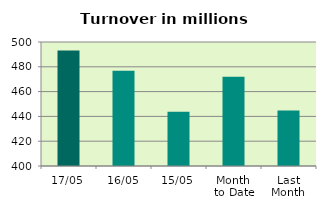
| Category | Series 0 |
|---|---|
| 17/05 | 493.06 |
| 16/05 | 476.755 |
| 15/05 | 443.79 |
| Month 
to Date | 472.02 |
| Last
Month | 444.663 |